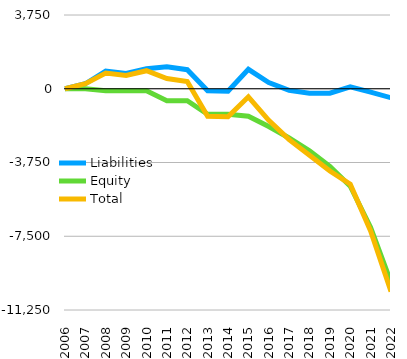
| Category | Liabilities  | Equity  | Total |
|---|---|---|---|
| 2006 | 0 | 0 | 0 |
| 2007 | 254 | 0 | 254 |
| 2008 | 900 | -104 | 796 |
| 2009 | 779 | -104 | 675 |
| 2010 | 1022 | -104 | 918 |
| 2011 | 1123 | -604 | 519 |
| 2012 | 971 | -604 | 367 |
| 2013 | -100 | -1297 | -1397 |
| 2014 | -128 | -1297 | -1425 |
| 2015 | 988 | -1397 | -409 |
| 2016 | 318 | -1923 | -1605 |
| 2017 | -85 | -2502 | -2587 |
| 2018 | -229 | -3152 | -3381 |
| 2019 | -229 | -3952 | -4181 |
| 2020 | 102 | -4953 | -4851 |
| 2021 | -175 | -7053 | -7228 |
| 2022 | -460 | -9853 | -10313 |